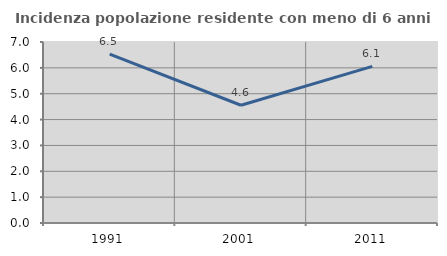
| Category | Incidenza popolazione residente con meno di 6 anni |
|---|---|
| 1991.0 | 6.53 |
| 2001.0 | 4.555 |
| 2011.0 | 6.058 |